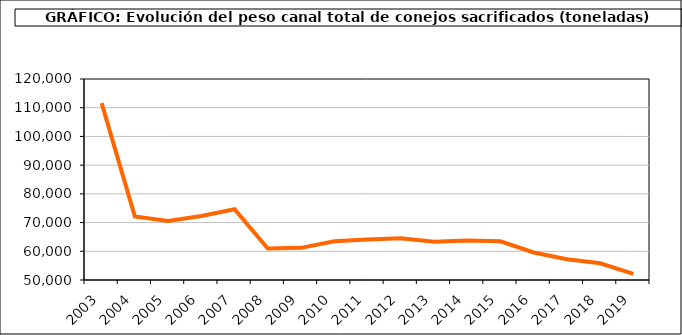
| Category | Peso canal |
|---|---|
| 2003.0 | 111582.524 |
| 2004.0 | 72158.367 |
| 2005.0 | 70523.95 |
| 2006.0 | 72307.553 |
| 2007.0 | 74666.407 |
| 2008.0 | 60960.313 |
| 2009.0 | 61195.132 |
| 2010.0 | 63505.334 |
| 2011.0 | 64139.488 |
| 2012.0 | 64578.018 |
| 2013.0 | 63288.914 |
| 2014.0 | 63789.699 |
| 2015.0 | 63460.686 |
| 2016.0 | 59589.334 |
| 2017.0 | 57257.988 |
| 2018.0 | 55823.653 |
| 2019.0 | 52143.325 |